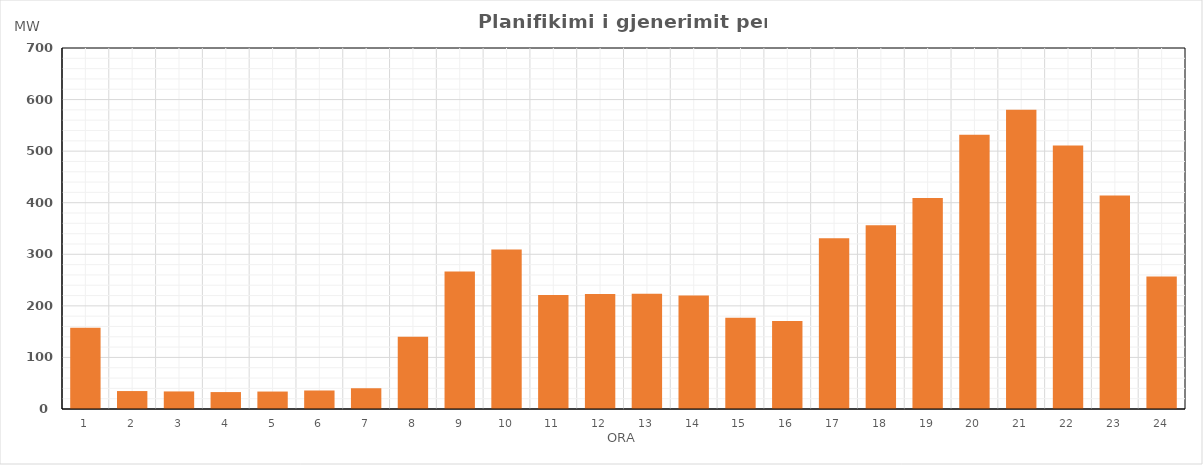
| Category | Max (MW) |
|---|---|
| 0 | 157.353 |
| 1 | 34.81 |
| 2 | 34.071 |
| 3 | 32.826 |
| 4 | 33.848 |
| 5 | 35.885 |
| 6 | 40.254 |
| 7 | 140.318 |
| 8 | 266.435 |
| 9 | 309.091 |
| 10 | 220.822 |
| 11 | 222.972 |
| 12 | 223.588 |
| 13 | 220.124 |
| 14 | 177.037 |
| 15 | 170.838 |
| 16 | 331.276 |
| 17 | 356.463 |
| 18 | 409.34 |
| 19 | 531.727 |
| 20 | 580.4 |
| 21 | 511.164 |
| 22 | 414.074 |
| 23 | 257.121 |